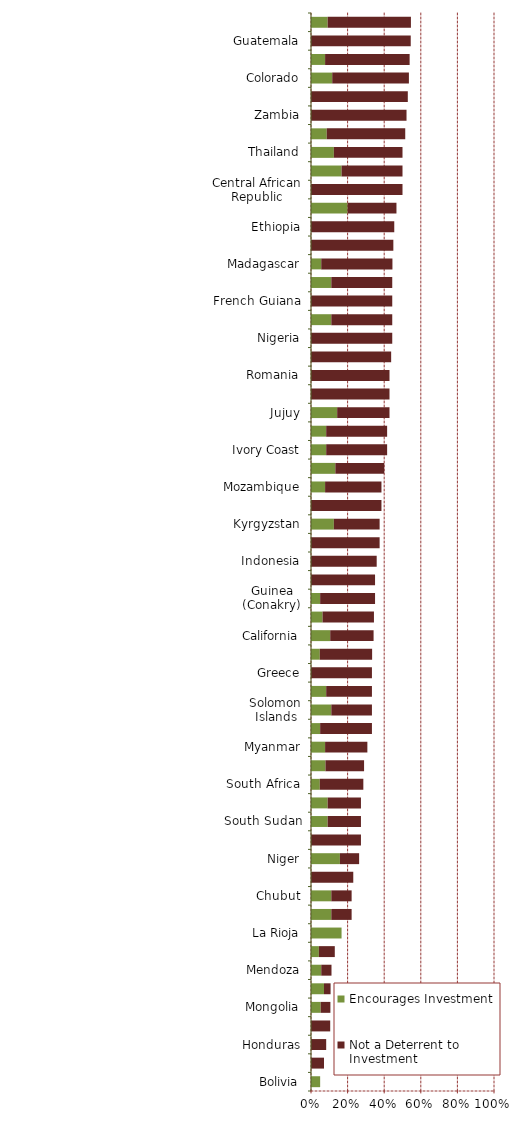
| Category | Encourages Investment | Not a Deterrent to Investment |
|---|---|---|
| Bolivia | 0.05 | 0 |
| Zimbabwe | 0 | 0.071 |
| Honduras | 0 | 0.083 |
| Santa Cruz | 0 | 0.105 |
| Mongolia | 0.053 | 0.053 |
| Ecuador | 0.071 | 0.036 |
| Mendoza | 0.056 | 0.056 |
| Venezuela | 0.043 | 0.087 |
| La Rioja | 0.167 | 0 |
| Sudan | 0.111 | 0.111 |
| Chubut | 0.111 | 0.111 |
| Dominican Republic | 0 | 0.231 |
| Niger | 0.158 | 0.105 |
| Egypt | 0 | 0.273 |
| South Sudan | 0.091 | 0.182 |
| Neuquen | 0.091 | 0.182 |
| South Africa | 0.048 | 0.238 |
| Brazil | 0.079 | 0.211 |
| Myanmar | 0.077 | 0.231 |
| Mexico | 0.05 | 0.283 |
| Solomon Islands | 0.111 | 0.222 |
| Angola | 0.083 | 0.25 |
| Greece | 0 | 0.333 |
| Washington | 0.048 | 0.286 |
| California | 0.105 | 0.237 |
| Democratic Republic of Congo (DRC) | 0.063 | 0.281 |
| Guinea (Conakry) | 0.05 | 0.3 |
| China | 0 | 0.35 |
| Indonesia | 0 | 0.359 |
| Suriname | 0 | 0.375 |
| Kyrgyzstan | 0.125 | 0.25 |
| Kenya | 0 | 0.385 |
| Mozambique | 0.077 | 0.308 |
| Russia | 0.133 | 0.267 |
| Ivory Coast | 0.083 | 0.333 |
| Kazakhstan | 0.083 | 0.333 |
| Jujuy | 0.143 | 0.286 |
| Hungary | 0 | 0.429 |
| Romania | 0 | 0.429 |
| Poland | 0 | 0.438 |
| Nigeria | 0 | 0.444 |
| San Juan | 0.111 | 0.333 |
| French Guiana | 0 | 0.444 |
| India | 0.111 | 0.333 |
| Madagascar | 0.056 | 0.389 |
| Philippines | 0 | 0.45 |
| Ethiopia | 0 | 0.455 |
| Rio Negro | 0.2 | 0.267 |
| Central African Republic | 0 | 0.5 |
| Catamarca | 0.167 | 0.333 |
| Thailand | 0.125 | 0.375 |
| Montana | 0.086 | 0.429 |
| Zambia | 0 | 0.522 |
| Eritrea | 0 | 0.529 |
| Colorado | 0.116 | 0.419 |
| France | 0.077 | 0.462 |
| Guatemala | 0 | 0.545 |
| Bulgaria | 0.091 | 0.455 |